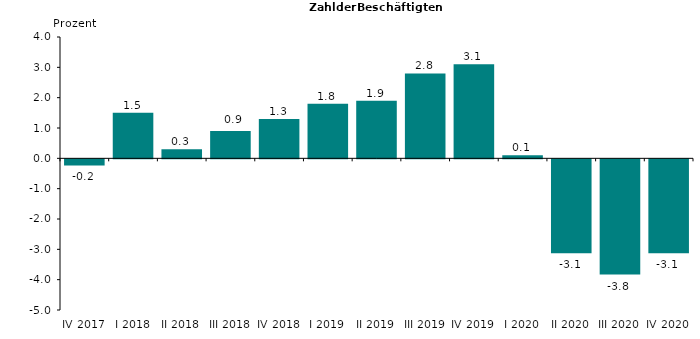
| Category | -0,2 |
|---|---|
| IV 2017 | -0.2 |
| I 2018 | 1.5 |
| II 2018 | 0.3 |
| III 2018 | 0.9 |
| IV 2018 | 1.3 |
| I 2019 | 1.8 |
| II 2019 | 1.9 |
| III 2019 | 2.8 |
| IV 2019 | 3.1 |
| I 2020 | 0.1 |
| II 2020 | -3.1 |
| III 2020 | -3.8 |
| IV 2020 | -3.1 |